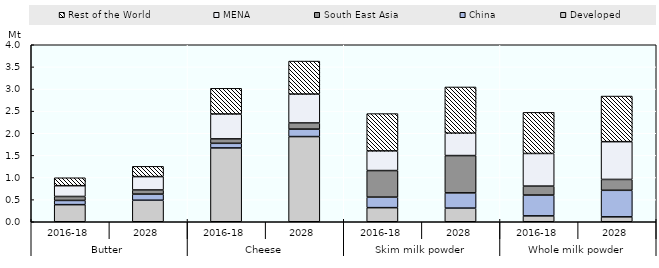
| Category | Developed | China | South East Asia | MENA | Rest of the World |
|---|---|---|---|---|---|
| 0 | 0.386 | 0.096 | 0.089 | 0.244 | 0.179 |
| 1 | 0.486 | 0.139 | 0.093 | 0.302 | 0.232 |
| 2 | 1.668 | 0.104 | 0.1 | 0.563 | 0.58 |
| 3 | 1.925 | 0.169 | 0.139 | 0.653 | 0.745 |
| 4 | 0.319 | 0.237 | 0.601 | 0.444 | 0.843 |
| 5 | 0.308 | 0.344 | 0.844 | 0.507 | 1.044 |
| 6 | 0.133 | 0.47 | 0.203 | 0.738 | 0.929 |
| 7 | 0.111 | 0.6 | 0.245 | 0.854 | 1.031 |